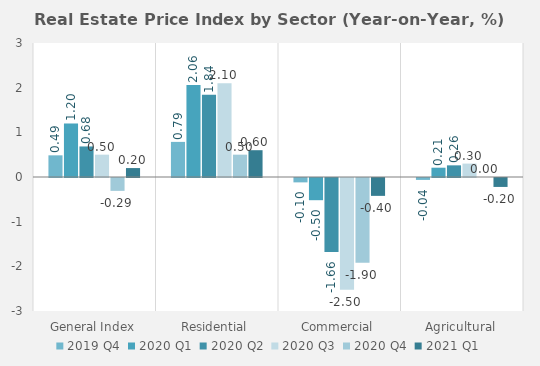
| Category | 2019 | 2020 | 2021 |
|---|---|---|---|
| General Index | 0.485 | -0.288 | 0.2 |
| Residential | 0.786 | 0.5 | 0.6 |
| Commercial | -0.098 | -1.9 | -0.4 |
| Agricultural | -0.043 | 0 | -0.2 |